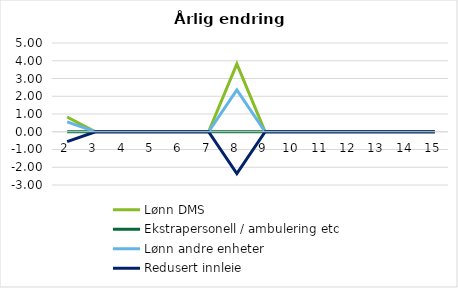
| Category | Lønn DMS | Ekstrapersonell / ambulering etc | Lønn andre enheter | Redusert innleie |
|---|---|---|---|---|
| 2.0 | 0.832 | 0 | 0.554 | -0.554 |
| 3.0 | 0 | 0 | 0 | 0 |
| 4.0 | 0 | 0 | 0 | 0 |
| 5.0 | 0 | 0 | 0 | 0 |
| 6.0 | 0 | 0 | 0 | 0 |
| 7.0 | 0 | 0 | 0 | 0 |
| 8.0 | 3.825 | 0 | 2.356 | -2.356 |
| 9.0 | 0 | 0 | 0 | 0 |
| 10.0 | 0 | 0 | 0 | 0 |
| 11.0 | 0 | 0 | 0 | 0 |
| 12.0 | 0 | 0 | 0 | 0 |
| 13.0 | 0 | 0 | 0 | 0 |
| 14.0 | 0 | 0 | 0 | 0 |
| 15.0 | 0 | 0 | 0 | 0 |